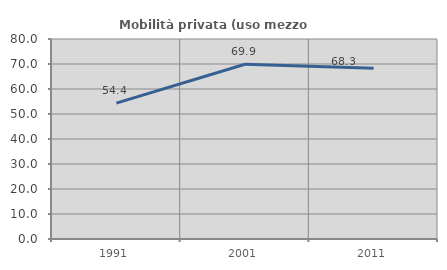
| Category | Mobilità privata (uso mezzo privato) |
|---|---|
| 1991.0 | 54.362 |
| 2001.0 | 69.898 |
| 2011.0 | 68.261 |